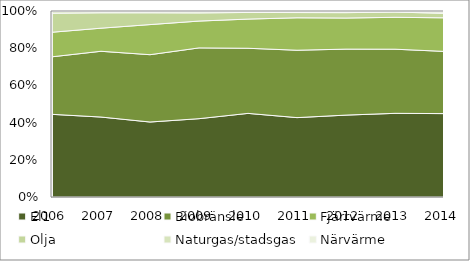
| Category | El1 | Biobränsle | Fjärrvärme | Olja | Naturgas/stadsgas | Närvärme |
|---|---|---|---|---|---|---|
| 2006.0 | 0.447 | 0.311 | 0.133 | 0.103 | 0.009 | 0.003 |
| 2007.0 | 0.43 | 0.354 | 0.124 | 0.083 | 0.006 | 0.003 |
| 2008.0 | 0.403 | 0.362 | 0.162 | 0.063 | 0.006 | 0.003 |
| 2009.0 | 0.421 | 0.381 | 0.144 | 0.044 | 0.006 | 0.004 |
| 2010.0 | 0.45 | 0.35 | 0.157 | 0.036 | 0.006 | 0.002 |
| 2011.0 | 0.427 | 0.362 | 0.174 | 0.028 | 0.004 | 0.005 |
| 2012.0 | 0.44 | 0.355 | 0.167 | 0.029 | 0.005 | 0.004 |
| 2013.0 | 0.45 | 0.345 | 0.172 | 0.028 | 0.003 | 0.003 |
| 2014.0 | 0.448 | 0.335 | 0.18 | 0.024 | 0.008 | 0.005 |